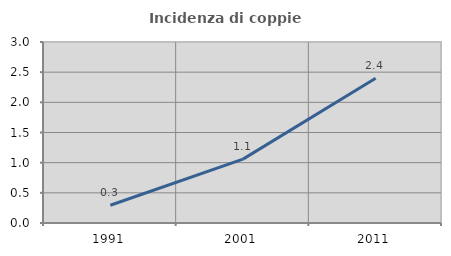
| Category | Incidenza di coppie miste |
|---|---|
| 1991.0 | 0.294 |
| 2001.0 | 1.058 |
| 2011.0 | 2.401 |